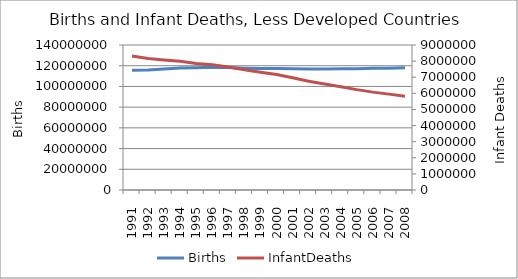
| Category | Births |
|---|---|
| 1991.0 | 115681851 |
| 1992.0 | 115797316 |
| 1993.0 | 116887507 |
| 1994.0 | 117737028 |
| 1995.0 | 117986504 |
| 1996.0 | 118559263 |
| 1997.0 | 118198138 |
| 1998.0 | 117629681 |
| 1999.0 | 117213368 |
| 2000.0 | 117220355 |
| 2001.0 | 116951839 |
| 2002.0 | 116854522 |
| 2003.0 | 116903030 |
| 2004.0 | 117098465 |
| 2005.0 | 117018546 |
| 2006.0 | 117581361 |
| 2007.0 | 117581362 |
| 2008.0 | 118066900 |